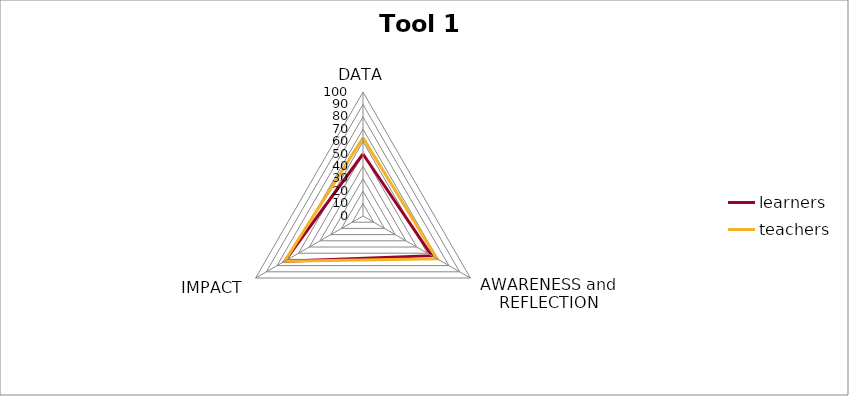
| Category | learners | teachers |
|---|---|---|
| DATA | 50 | 63 |
| AWARENESS and REFLECTION | 64 | 69 |
| IMPACT | 73 | 73 |